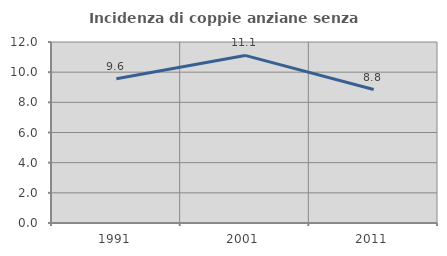
| Category | Incidenza di coppie anziane senza figli  |
|---|---|
| 1991.0 | 9.565 |
| 2001.0 | 11.111 |
| 2011.0 | 8.85 |